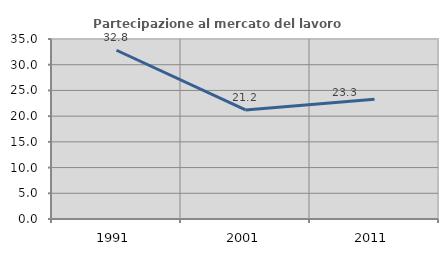
| Category | Partecipazione al mercato del lavoro  femminile |
|---|---|
| 1991.0 | 32.815 |
| 2001.0 | 21.202 |
| 2011.0 | 23.265 |